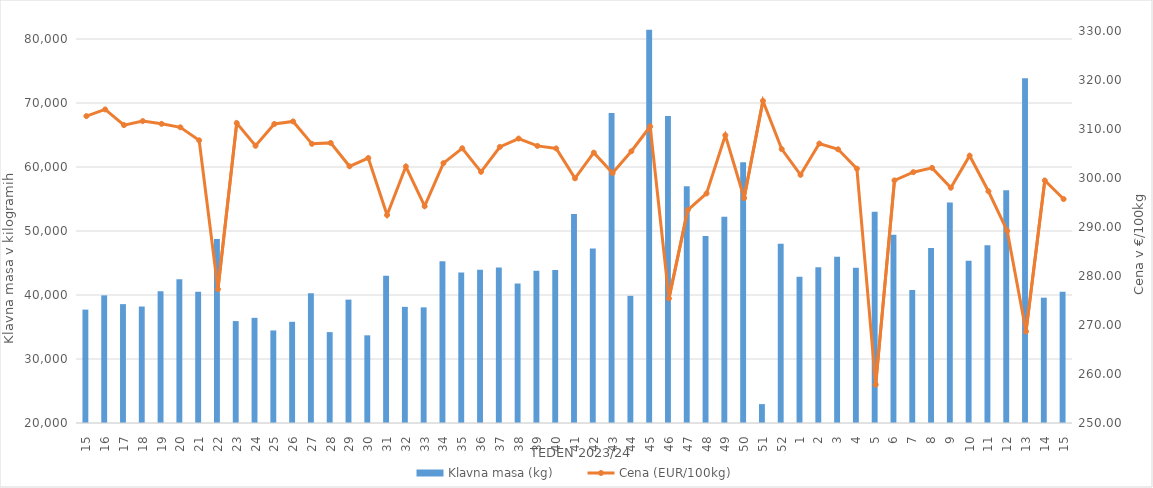
| Category | Klavna masa (kg) |
|---|---|
| 15.0 | 37719 |
| 16.0 | 39943 |
| 17.0 | 38574 |
| 18.0 | 38200 |
| 19.0 | 40581 |
| 20.0 | 42443 |
| 21.0 | 40517 |
| 22.0 | 48742 |
| 23.0 | 35927 |
| 24.0 | 36436 |
| 25.0 | 34463 |
| 26.0 | 35812 |
| 27.0 | 40280 |
| 28.0 | 34201 |
| 29.0 | 39279 |
| 30.0 | 33702 |
| 31.0 | 43020 |
| 32.0 | 38146 |
| 33.0 | 38070 |
| 34.0 | 45290 |
| 35.0 | 43513 |
| 36.0 | 43945 |
| 37.0 | 44302 |
| 38.0 | 41798 |
| 39.0 | 43790 |
| 40.0 | 43913 |
| 41.0 | 52663 |
| 42.0 | 47275 |
| 43.0 | 68419 |
| 44.0 | 39872 |
| 45.0 | 81439 |
| 46.0 | 67983 |
| 47.0 | 57006 |
| 48.0 | 49204 |
| 49.0 | 52219 |
| 50.0 | 60759 |
| 51.0 | 22954 |
| 52.0 | 48002 |
| 1.0 | 42866 |
| 2.0 | 44318 |
| 3.0 | 45969 |
| 4.0 | 44266 |
| 5.0 | 52991 |
| 6.0 | 49406 |
| 7.0 | 40769 |
| 8.0 | 47349 |
| 9.0 | 54448 |
| 10.0 | 45343 |
| 11.0 | 47770 |
| 12.0 | 56370 |
| 13.0 | 73886 |
| 14.0 | 39581 |
| 15.0 | 40490 |